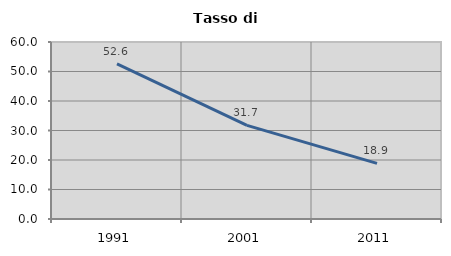
| Category | Tasso di disoccupazione   |
|---|---|
| 1991.0 | 52.62 |
| 2001.0 | 31.746 |
| 2011.0 | 18.862 |